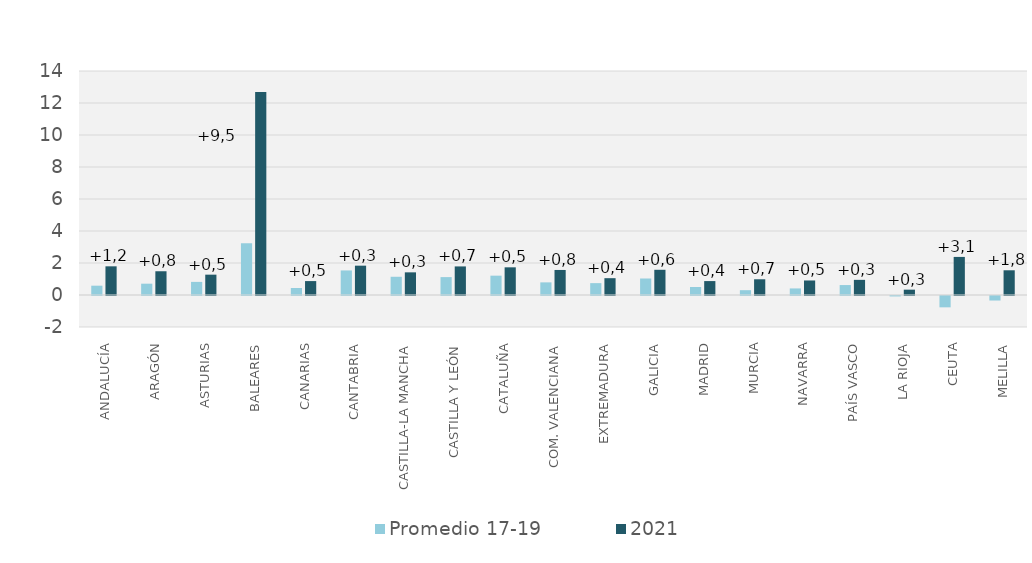
| Category | Promedio 17-19 | 2021 |
|---|---|---|
| ANDALUCÍA | 0.582 | 1.792 |
| ARAGÓN | 0.707 | 1.484 |
| ASTURIAS | 0.819 | 1.271 |
| BALEARES | 3.234 | 12.692 |
| CANARIAS | 0.437 | 0.87 |
| CANTABRIA | 1.535 | 1.833 |
| CASTILLA-LA MANCHA | 1.139 | 1.416 |
| CASTILLA Y LEÓN | 1.118 | 1.786 |
| CATALUÑA | 1.208 | 1.73 |
| COM. VALENCIANA | 0.789 | 1.565 |
| EXTREMADURA | 0.742 | 1.051 |
| GALICIA | 1.032 | 1.576 |
| MADRID | 0.501 | 0.87 |
| MURCIA | 0.301 | 0.983 |
| NAVARRA | 0.411 | 0.908 |
| PAÍS VASCO | 0.622 | 0.947 |
| LA RIOJA | -0.027 | 0.334 |
| CEUTA | -0.708 | 2.38 |
| MELILLA | -0.283 | 1.545 |